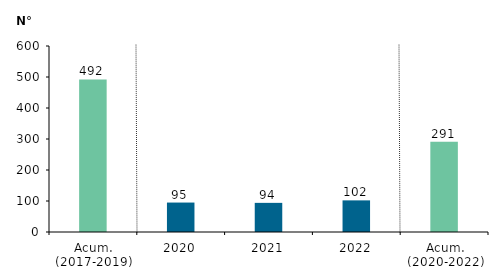
| Category | Series 0 |
|---|---|
| Acum. (2017-2019) | 492 |
| 2020 | 95 |
| 2021 | 94 |
| 2022 | 102 |
| Acum. (2020-2022) | 291 |